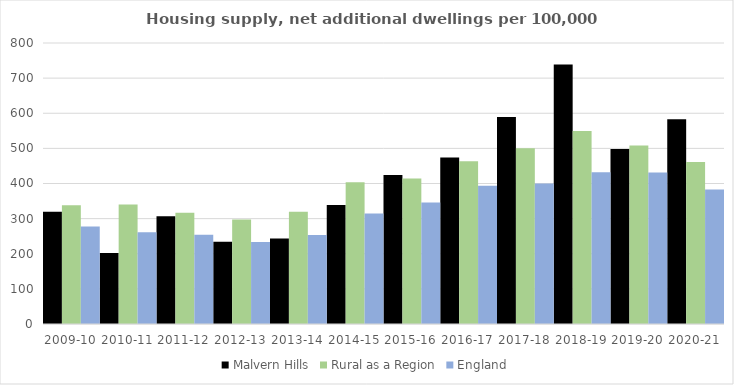
| Category | Malvern Hills | Rural as a Region | England |
|---|---|---|---|
| 2009-10 | 319.391 | 337.852 | 277.548 |
| 2010-11 | 202.302 | 340.105 | 260.994 |
| 2011-12 | 306.535 | 317.04 | 254.007 |
| 2012-13 | 234.385 | 297.763 | 233.153 |
| 2013-14 | 243.515 | 319.835 | 253.602 |
| 2014-15 | 338.476 | 403.796 | 314.256 |
| 2015-16 | 424.241 | 414.091 | 346.154 |
| 2016-17 | 474.169 | 463.209 | 393.256 |
| 2017-18 | 589.646 | 500.68 | 399.646 |
| 2018-19 | 738.673 | 549.491 | 432.099 |
| 2019-20 | 498.107 | 508.493 | 431.187 |
| 2020-21 | 582.793 | 461.114 | 382.827 |